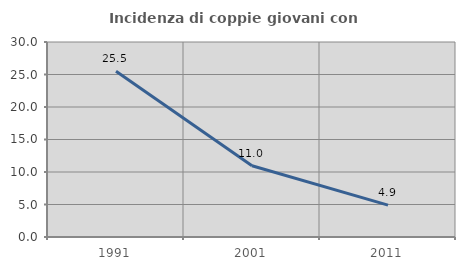
| Category | Incidenza di coppie giovani con figli |
|---|---|
| 1991.0 | 25.496 |
| 2001.0 | 10.952 |
| 2011.0 | 4.896 |